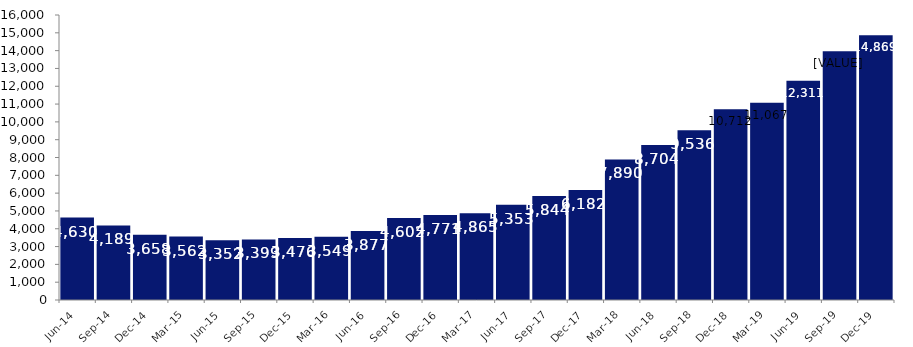
| Category | Series 0 |
|---|---|
| Jun-14 | 4630 |
| Sep-14 | 4189 |
| Dec-14 | 3658 |
| Mar-15 | 3562 |
| Jun-15 | 3352 |
| Sep-15 | 3399 |
| Dec-15 | 3476 |
| Mar-16 | 3549 |
| Jun-16 | 3877 |
| Sep-16 | 4602 |
| Dec-16 | 4771 |
| Mar-17 | 4865 |
| Jun-17 | 5353 |
| Sep-17 | 5844 |
| Dec-17 | 6182 |
| Mar-18 | 7890 |
| Jun-18 | 8704 |
| Sep-18 | 9536 |
| Dec-18 | 10712 |
| Mar-19 | 11067 |
| Jun-19 | 12311 |
| Sep-19 | 13966 |
| Dec-19 | 14869 |